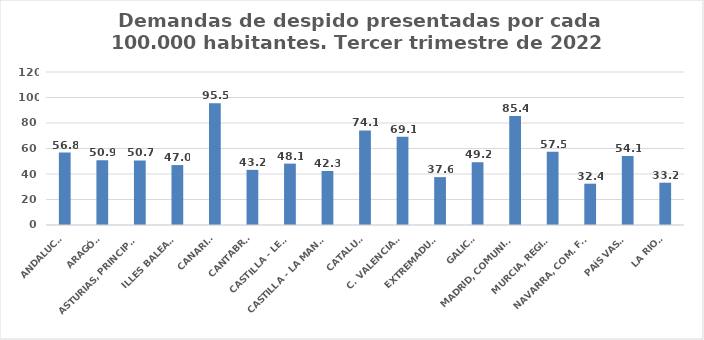
| Category | Series 0 |
|---|---|
| ANDALUCÍA | 56.835 |
| ARAGÓN | 50.855 |
| ASTURIAS, PRINCIPADO | 50.672 |
| ILLES BALEARS | 47.014 |
| CANARIAS | 95.524 |
| CANTABRIA | 43.231 |
| CASTILLA - LEÓN | 48.142 |
| CASTILLA - LA MANCHA | 42.345 |
| CATALUÑA | 74.133 |
| C. VALENCIANA | 69.124 |
| EXTREMADURA | 37.562 |
| GALICIA | 49.235 |
| MADRID, COMUNIDAD | 85.418 |
| MURCIA, REGIÓN | 57.462 |
| NAVARRA, COM. FORAL | 32.398 |
| PAÍS VASCO | 54.141 |
| LA RIOJA | 33.178 |